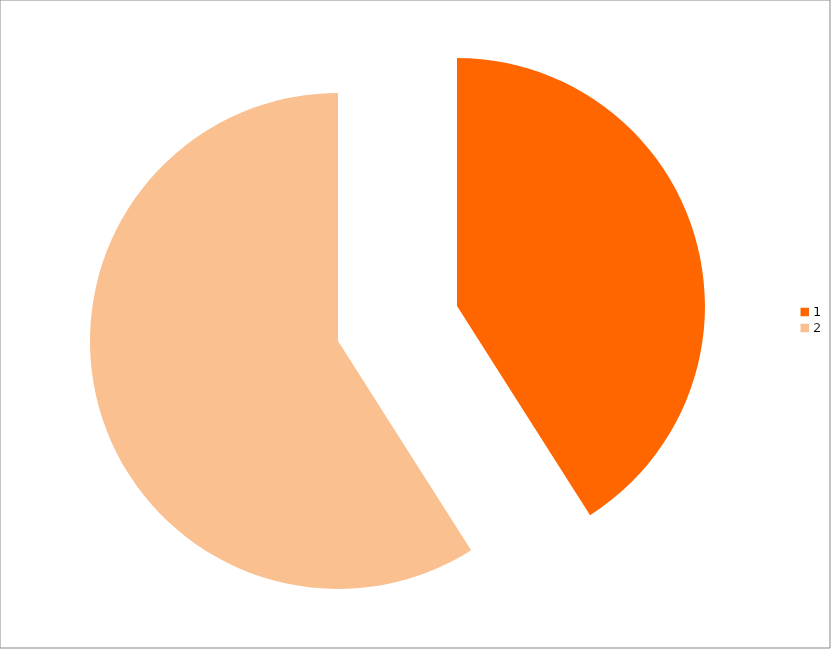
| Category | Series 0 |
|---|---|
| 0 | 25 |
| 1 | 36 |